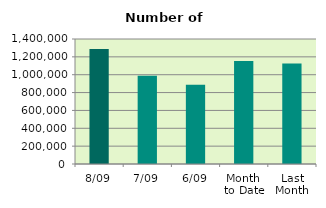
| Category | Series 0 |
|---|---|
| 8/09 | 1288602 |
| 7/09 | 988466 |
| 6/09 | 887248 |
| Month 
to Date | 1154487 |
| Last
Month | 1124493.364 |